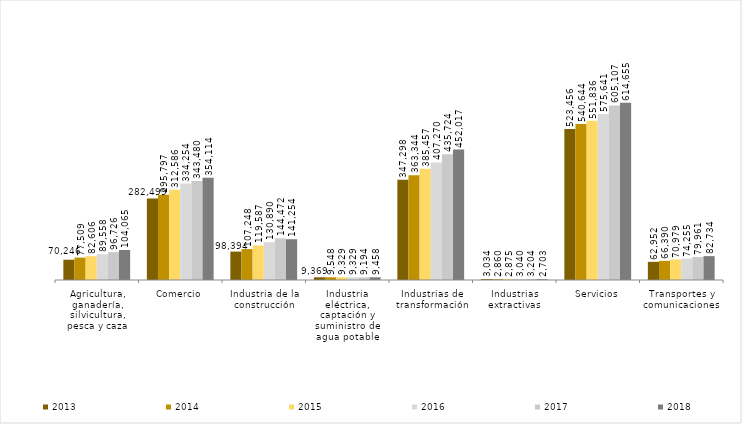
| Category | 2013 | 2014 | 2015 | 2016 | 2017 | 2018 |
|---|---|---|---|---|---|---|
| Agricultura, ganadería, silvicultura, pesca y caza | 70246 | 77509 | 82606 | 89558 | 96726 | 104065 |
| Comercio | 282499 | 295797 | 312586 | 334254 | 343480 | 354114 |
| Industria de la construcción | 98394 | 107248 | 119587 | 130890 | 144472 | 141254 |
| Industria eléctrica, captación y suministro de agua potable | 9369 | 9548 | 9329 | 9329 | 9194 | 9458 |
| Industrias de transformación | 347298 | 363344 | 385457 | 407270 | 435724 | 452017 |
| Industrias extractivas | 3034 | 2860 | 2875 | 3040 | 3204 | 2703 |
| Servicios | 523456 | 540644 | 551836 | 575641 | 605107 | 614655 |
| Transportes y comunicaciones | 62952 | 66390 | 70979 | 74255 | 79961 | 82734 |